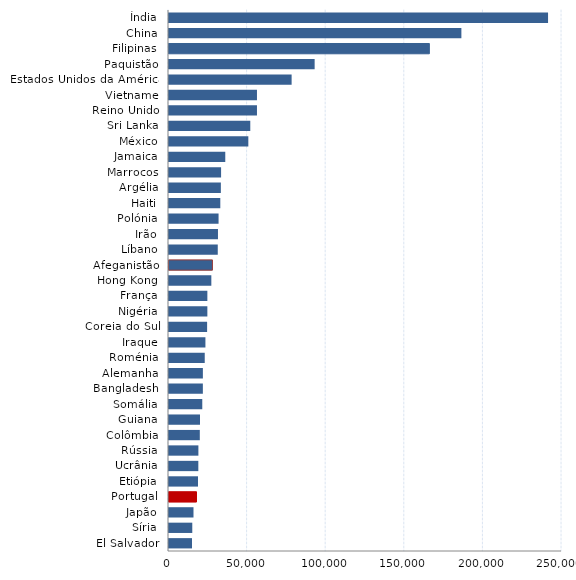
| Category | Series 0 |
|---|---|
| Índia | 241130 |
| China | 185995 |
| Filipinas | 165625 |
| Paquistão | 92645 |
| Estados Unidos da América | 78005 |
| Vietname | 55960 |
| Reino Unido | 55960 |
| Sri Lanka | 51710 |
| México | 50465 |
| Jamaica | 35795 |
| Marrocos | 33135 |
| Argélia | 32990 |
| Haiti | 32635 |
| Polónia | 31530 |
| Irão | 31155 |
| Líbano | 31020 |
| Afeganistão | 27615 |
| Hong Kong | 26930 |
| França | 24400 |
| Nigéria | 24400 |
| Coreia do Sul | 24250 |
| Iraque | 23170 |
| Roménia | 22735 |
| Alemanha | 21550 |
| Bangladesh | 21540 |
| Somália | 21170 |
| Guiana | 19705 |
| Colômbia | 19600 |
| Rússia | 18700 |
| Ucrânia | 18655 |
| Etiópia | 18465 |
| Portugal | 17490 |
| Japão | 15580 |
| Síria | 14810 |
| El Salvador | 14615 |